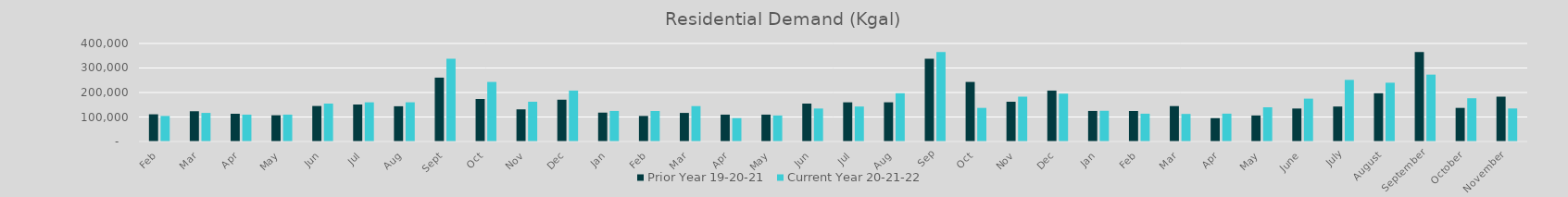
| Category | Prior Year 19-20-21 | Current Year 20-21-22 |
|---|---|---|
| Feb | 111009.962 | 104204.224 |
| Mar | 123525.131 | 116687.491 |
| Apr | 113258.787 | 109598.965 |
| May | 107128.051 | 109656.015 |
| Jun | 144930.453 | 154696.236 |
| Jul | 151028.014 | 159889.353 |
| Aug | 143816.337 | 160013.985 |
| Sep | 260607.456 | 337995.641 |
| Oct | 173601.368 | 243049.084 |
| Nov | 131198.833 | 162175.563 |
| Dec | 170629.384 | 207737.904 |
| Jan | 117899.625 | 124779.797 |
| Feb | 104204.224 | 124538.238 |
| Mar | 116687.491 | 144510.137 |
| Apr | 109598.965 | 95313.825 |
| May | 109656.015 | 106271.913 |
| Jun | 154696.236 | 134556.172 |
| Jul | 159889.353 | 142779.003 |
| Aug | 160013.985 | 196888.231 |
| Sep | 337995.641 | 364911.478 |
| Oct | 243049.084 | 137121.969 |
| Nov | 162175.563 | 182996.966 |
| Dec | 207737.904 | 195285.925 |
| Jan | 124779.797 | 125449.092 |
| Feb | 124538.238 | 113415.44 |
| Mar | 144510.137 | 112550.393 |
| Apr | 95313.825 | 113675.535 |
| May | 106271.913 | 139571.108 |
| June | 134556.172 | 175001.205 |
| July | 142779.003 | 251418.545 |
| August | 196888.231 | 239882.104 |
| September | 364911.478 | 272999.505 |
| October | 137121.969 | 176503.884 |
| November | 182996.966 | 134760.854 |